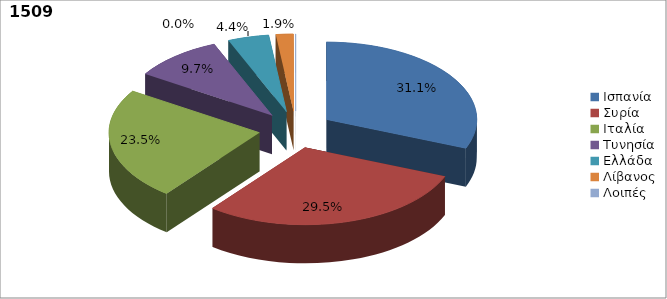
| Category | Series 0 |
|---|---|
| Ισπανία | 0.311 |
| Συρία | 0.295 |
| Ιταλία | 0.235 |
| Τυνησία | 0.097 |
| Ελλάδα | 0.044 |
| Λίβανος | 0.019 |
| Λοιπές | 0 |